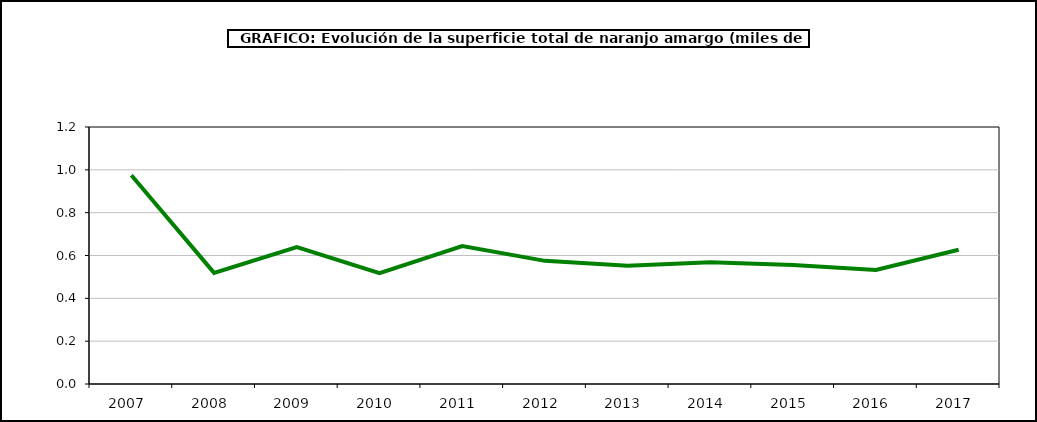
| Category | superficie |
|---|---|
| 2007.0 | 0.975 |
| 2008.0 | 0.519 |
| 2009.0 | 0.639 |
| 2010.0 | 0.518 |
| 2011.0 | 0.644 |
| 2012.0 | 0.575 |
| 2013.0 | 0.552 |
| 2014.0 | 0.569 |
| 2015.0 | 0.556 |
| 2016.0 | 0.532 |
| 2017.0 | 0.627 |